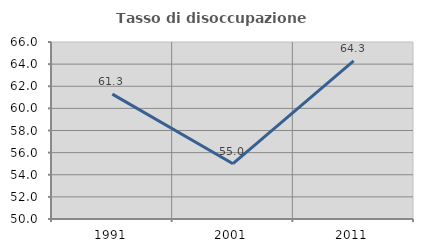
| Category | Tasso di disoccupazione giovanile  |
|---|---|
| 1991.0 | 61.29 |
| 2001.0 | 55 |
| 2011.0 | 64.286 |